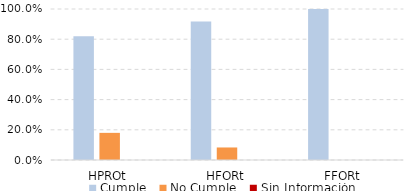
| Category | Cumple | No Cumple | Sin Información |
|---|---|---|---|
| HPROt | 0.82 | 0.18 | 0 |
| HFORt | 0.917 | 0.083 | 0 |
| FFORt | 1 | 0 | 0 |